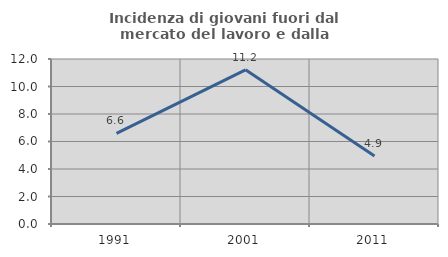
| Category | Incidenza di giovani fuori dal mercato del lavoro e dalla formazione  |
|---|---|
| 1991.0 | 6.593 |
| 2001.0 | 11.211 |
| 2011.0 | 4.945 |